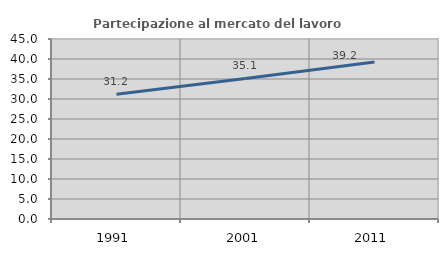
| Category | Partecipazione al mercato del lavoro  femminile |
|---|---|
| 1991.0 | 31.162 |
| 2001.0 | 35.127 |
| 2011.0 | 39.235 |